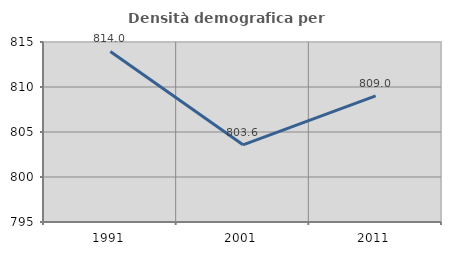
| Category | Densità demografica |
|---|---|
| 1991.0 | 813.954 |
| 2001.0 | 803.578 |
| 2011.0 | 809.019 |